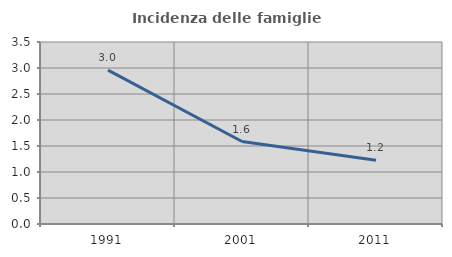
| Category | Incidenza delle famiglie numerose |
|---|---|
| 1991.0 | 2.958 |
| 2001.0 | 1.586 |
| 2011.0 | 1.226 |